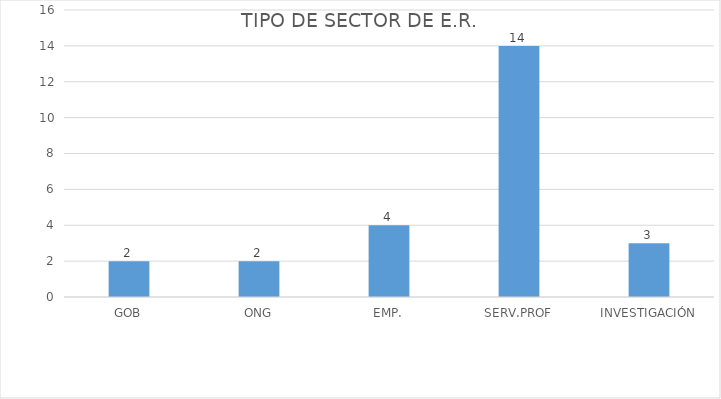
| Category | Series 0 |
|---|---|
| GOB | 2 |
| ONG | 2 |
| EMP. | 4 |
| SERV.PROF | 14 |
| INVESTIGACIÓN | 3 |